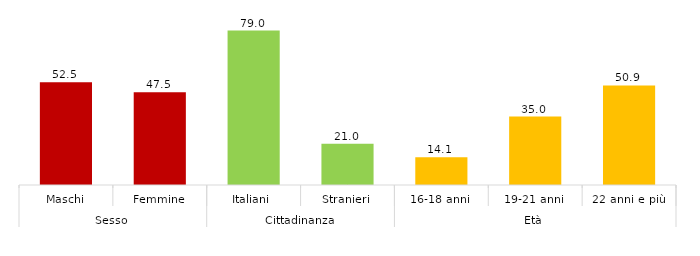
| Category | % |
|---|---|
| 0 | 52.521 |
| 1 | 47.479 |
| 2 | 78.97 |
| 3 | 21.03 |
| 4 | 14.134 |
| 5 | 34.966 |
| 6 | 50.9 |